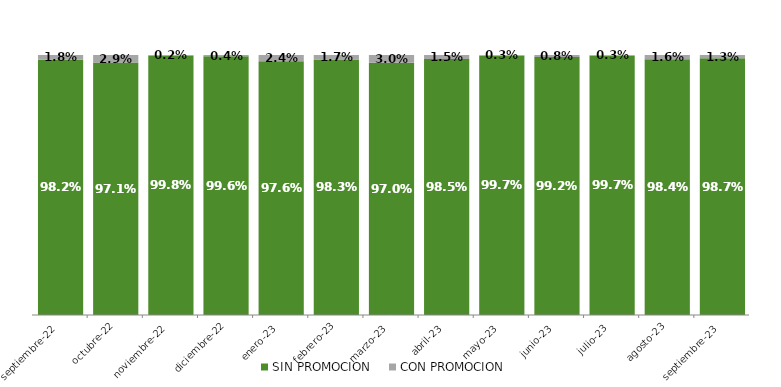
| Category | SIN PROMOCION   | CON PROMOCION   |
|---|---|---|
| 2022-09-01 | 0.982 | 0.018 |
| 2022-10-01 | 0.971 | 0.029 |
| 2022-11-01 | 0.998 | 0.002 |
| 2022-12-01 | 0.996 | 0.004 |
| 2023-01-01 | 0.976 | 0.024 |
| 2023-02-01 | 0.983 | 0.017 |
| 2023-03-01 | 0.97 | 0.03 |
| 2023-04-01 | 0.985 | 0.015 |
| 2023-05-01 | 0.997 | 0.003 |
| 2023-06-01 | 0.992 | 0.008 |
| 2023-07-01 | 0.997 | 0.003 |
| 2023-08-01 | 0.984 | 0.016 |
| 2023-09-01 | 0.987 | 0.013 |